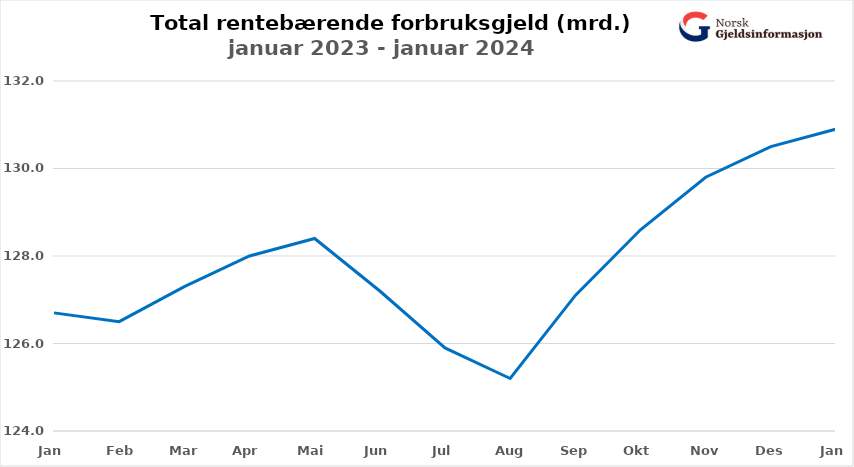
| Category | Rentebærende forbruksgjeld |
|---|---|
| Jan | 126.7 |
| Feb | 126.5 |
| Mar | 127.3 |
| Apr | 128 |
| Mai | 128.4 |
| Jun | 127.2 |
| Jul | 125.9 |
| Aug | 125.2 |
| Sep | 127.1 |
| Okt | 128.6 |
| Nov | 129.8 |
| Des | 130.5 |
| Jan | 130.9 |